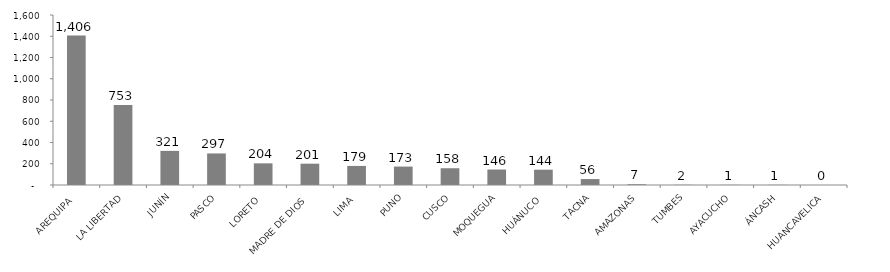
| Category | Series 0 |
|---|---|
|   AREQUIPA | 1406.157 |
|   LA LIBERTAD | 753.105 |
|   JUNÍN | 321.272 |
|   PASCO | 297.083 |
|   LORETO | 203.84 |
|   MADRE DE DIOS | 200.555 |
|   LIMA | 179.498 |
|   PUNO | 173.481 |
|   CUSCO | 157.82 |
|   MOQUEGUA | 145.636 |
|   HUÁNUCO | 143.96 |
|   TACNA | 55.857 |
|   AMAZONAS | 7.026 |
|   TUMBES | 1.645 |
|   AYACUCHO | 1.329 |
|   ÁNCASH | 1.232 |
|   HUANCAVELICA | 0.049 |